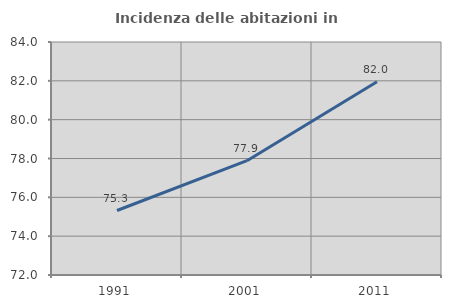
| Category | Incidenza delle abitazioni in proprietà  |
|---|---|
| 1991.0 | 75.322 |
| 2001.0 | 77.886 |
| 2011.0 | 81.953 |